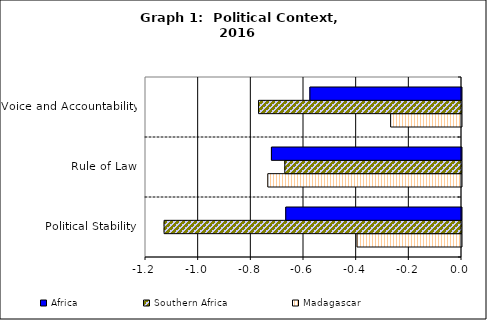
| Category | Madagascar | Southern Africa | Africa |
|---|---|---|---|
| Political Stability | -0.397 | -1.129 | -0.667 |
| Rule of Law | -0.736 | -0.671 | -0.722 |
| Voice and Accountability | -0.269 | -0.771 | -0.576 |